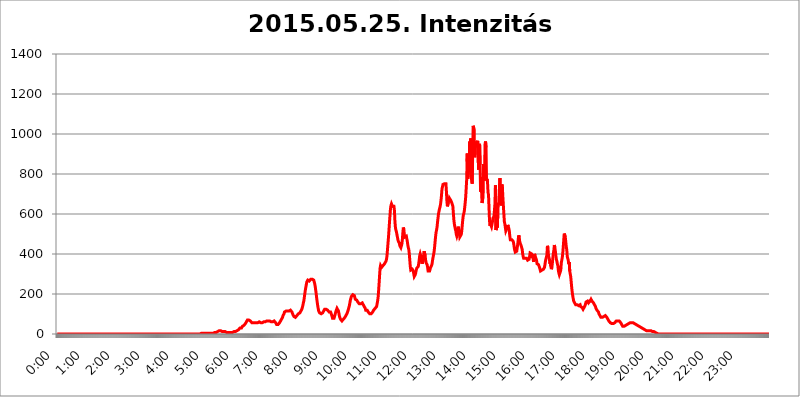
| Category | 2015.05.25. Intenzitás [W/m^2] |
|---|---|
| 0.0 | 0 |
| 0.0006944444444444445 | 0 |
| 0.001388888888888889 | 0 |
| 0.0020833333333333333 | 0 |
| 0.002777777777777778 | 0 |
| 0.003472222222222222 | 0 |
| 0.004166666666666667 | 0 |
| 0.004861111111111111 | 0 |
| 0.005555555555555556 | 0 |
| 0.0062499999999999995 | 0 |
| 0.006944444444444444 | 0 |
| 0.007638888888888889 | 0 |
| 0.008333333333333333 | 0 |
| 0.009027777777777779 | 0 |
| 0.009722222222222222 | 0 |
| 0.010416666666666666 | 0 |
| 0.011111111111111112 | 0 |
| 0.011805555555555555 | 0 |
| 0.012499999999999999 | 0 |
| 0.013194444444444444 | 0 |
| 0.013888888888888888 | 0 |
| 0.014583333333333332 | 0 |
| 0.015277777777777777 | 0 |
| 0.015972222222222224 | 0 |
| 0.016666666666666666 | 0 |
| 0.017361111111111112 | 0 |
| 0.018055555555555557 | 0 |
| 0.01875 | 0 |
| 0.019444444444444445 | 0 |
| 0.02013888888888889 | 0 |
| 0.020833333333333332 | 0 |
| 0.02152777777777778 | 0 |
| 0.022222222222222223 | 0 |
| 0.02291666666666667 | 0 |
| 0.02361111111111111 | 0 |
| 0.024305555555555556 | 0 |
| 0.024999999999999998 | 0 |
| 0.025694444444444447 | 0 |
| 0.02638888888888889 | 0 |
| 0.027083333333333334 | 0 |
| 0.027777777777777776 | 0 |
| 0.02847222222222222 | 0 |
| 0.029166666666666664 | 0 |
| 0.029861111111111113 | 0 |
| 0.030555555555555555 | 0 |
| 0.03125 | 0 |
| 0.03194444444444445 | 0 |
| 0.03263888888888889 | 0 |
| 0.03333333333333333 | 0 |
| 0.034027777777777775 | 0 |
| 0.034722222222222224 | 0 |
| 0.035416666666666666 | 0 |
| 0.036111111111111115 | 0 |
| 0.03680555555555556 | 0 |
| 0.0375 | 0 |
| 0.03819444444444444 | 0 |
| 0.03888888888888889 | 0 |
| 0.03958333333333333 | 0 |
| 0.04027777777777778 | 0 |
| 0.04097222222222222 | 0 |
| 0.041666666666666664 | 0 |
| 0.042361111111111106 | 0 |
| 0.04305555555555556 | 0 |
| 0.043750000000000004 | 0 |
| 0.044444444444444446 | 0 |
| 0.04513888888888889 | 0 |
| 0.04583333333333334 | 0 |
| 0.04652777777777778 | 0 |
| 0.04722222222222222 | 0 |
| 0.04791666666666666 | 0 |
| 0.04861111111111111 | 0 |
| 0.049305555555555554 | 0 |
| 0.049999999999999996 | 0 |
| 0.05069444444444445 | 0 |
| 0.051388888888888894 | 0 |
| 0.052083333333333336 | 0 |
| 0.05277777777777778 | 0 |
| 0.05347222222222222 | 0 |
| 0.05416666666666667 | 0 |
| 0.05486111111111111 | 0 |
| 0.05555555555555555 | 0 |
| 0.05625 | 0 |
| 0.05694444444444444 | 0 |
| 0.057638888888888885 | 0 |
| 0.05833333333333333 | 0 |
| 0.05902777777777778 | 0 |
| 0.059722222222222225 | 0 |
| 0.06041666666666667 | 0 |
| 0.061111111111111116 | 0 |
| 0.06180555555555556 | 0 |
| 0.0625 | 0 |
| 0.06319444444444444 | 0 |
| 0.06388888888888888 | 0 |
| 0.06458333333333334 | 0 |
| 0.06527777777777778 | 0 |
| 0.06597222222222222 | 0 |
| 0.06666666666666667 | 0 |
| 0.06736111111111111 | 0 |
| 0.06805555555555555 | 0 |
| 0.06874999999999999 | 0 |
| 0.06944444444444443 | 0 |
| 0.07013888888888889 | 0 |
| 0.07083333333333333 | 0 |
| 0.07152777777777779 | 0 |
| 0.07222222222222223 | 0 |
| 0.07291666666666667 | 0 |
| 0.07361111111111111 | 0 |
| 0.07430555555555556 | 0 |
| 0.075 | 0 |
| 0.07569444444444444 | 0 |
| 0.0763888888888889 | 0 |
| 0.07708333333333334 | 0 |
| 0.07777777777777778 | 0 |
| 0.07847222222222222 | 0 |
| 0.07916666666666666 | 0 |
| 0.0798611111111111 | 0 |
| 0.08055555555555556 | 0 |
| 0.08125 | 0 |
| 0.08194444444444444 | 0 |
| 0.08263888888888889 | 0 |
| 0.08333333333333333 | 0 |
| 0.08402777777777777 | 0 |
| 0.08472222222222221 | 0 |
| 0.08541666666666665 | 0 |
| 0.08611111111111112 | 0 |
| 0.08680555555555557 | 0 |
| 0.08750000000000001 | 0 |
| 0.08819444444444445 | 0 |
| 0.08888888888888889 | 0 |
| 0.08958333333333333 | 0 |
| 0.09027777777777778 | 0 |
| 0.09097222222222222 | 0 |
| 0.09166666666666667 | 0 |
| 0.09236111111111112 | 0 |
| 0.09305555555555556 | 0 |
| 0.09375 | 0 |
| 0.09444444444444444 | 0 |
| 0.09513888888888888 | 0 |
| 0.09583333333333333 | 0 |
| 0.09652777777777777 | 0 |
| 0.09722222222222222 | 0 |
| 0.09791666666666667 | 0 |
| 0.09861111111111111 | 0 |
| 0.09930555555555555 | 0 |
| 0.09999999999999999 | 0 |
| 0.10069444444444443 | 0 |
| 0.1013888888888889 | 0 |
| 0.10208333333333335 | 0 |
| 0.10277777777777779 | 0 |
| 0.10347222222222223 | 0 |
| 0.10416666666666667 | 0 |
| 0.10486111111111111 | 0 |
| 0.10555555555555556 | 0 |
| 0.10625 | 0 |
| 0.10694444444444444 | 0 |
| 0.1076388888888889 | 0 |
| 0.10833333333333334 | 0 |
| 0.10902777777777778 | 0 |
| 0.10972222222222222 | 0 |
| 0.1111111111111111 | 0 |
| 0.11180555555555556 | 0 |
| 0.11180555555555556 | 0 |
| 0.1125 | 0 |
| 0.11319444444444444 | 0 |
| 0.11388888888888889 | 0 |
| 0.11458333333333333 | 0 |
| 0.11527777777777777 | 0 |
| 0.11597222222222221 | 0 |
| 0.11666666666666665 | 0 |
| 0.1173611111111111 | 0 |
| 0.11805555555555557 | 0 |
| 0.11944444444444445 | 0 |
| 0.12013888888888889 | 0 |
| 0.12083333333333333 | 0 |
| 0.12152777777777778 | 0 |
| 0.12222222222222223 | 0 |
| 0.12291666666666667 | 0 |
| 0.12291666666666667 | 0 |
| 0.12361111111111112 | 0 |
| 0.12430555555555556 | 0 |
| 0.125 | 0 |
| 0.12569444444444444 | 0 |
| 0.12638888888888888 | 0 |
| 0.12708333333333333 | 0 |
| 0.16875 | 0 |
| 0.12847222222222224 | 0 |
| 0.12916666666666668 | 0 |
| 0.12986111111111112 | 0 |
| 0.13055555555555556 | 0 |
| 0.13125 | 0 |
| 0.13194444444444445 | 0 |
| 0.1326388888888889 | 0 |
| 0.13333333333333333 | 0 |
| 0.13402777777777777 | 0 |
| 0.13402777777777777 | 0 |
| 0.13472222222222222 | 0 |
| 0.13541666666666666 | 0 |
| 0.1361111111111111 | 0 |
| 0.13749999999999998 | 0 |
| 0.13819444444444443 | 0 |
| 0.1388888888888889 | 0 |
| 0.13958333333333334 | 0 |
| 0.14027777777777778 | 0 |
| 0.14097222222222222 | 0 |
| 0.14166666666666666 | 0 |
| 0.1423611111111111 | 0 |
| 0.14305555555555557 | 0 |
| 0.14375000000000002 | 0 |
| 0.14444444444444446 | 0 |
| 0.1451388888888889 | 0 |
| 0.1451388888888889 | 0 |
| 0.14652777777777778 | 0 |
| 0.14722222222222223 | 0 |
| 0.14791666666666667 | 0 |
| 0.1486111111111111 | 0 |
| 0.14930555555555555 | 0 |
| 0.15 | 0 |
| 0.15069444444444444 | 0 |
| 0.15138888888888888 | 0 |
| 0.15208333333333332 | 0 |
| 0.15277777777777776 | 0 |
| 0.15347222222222223 | 0 |
| 0.15416666666666667 | 0 |
| 0.15486111111111112 | 0 |
| 0.15555555555555556 | 0 |
| 0.15625 | 0 |
| 0.15694444444444444 | 0 |
| 0.15763888888888888 | 0 |
| 0.15833333333333333 | 0 |
| 0.15902777777777777 | 0 |
| 0.15972222222222224 | 0 |
| 0.16041666666666668 | 0 |
| 0.16111111111111112 | 0 |
| 0.16180555555555556 | 0 |
| 0.1625 | 0 |
| 0.16319444444444445 | 0 |
| 0.1638888888888889 | 0 |
| 0.16458333333333333 | 0 |
| 0.16527777777777777 | 0 |
| 0.16597222222222222 | 0 |
| 0.16666666666666666 | 0 |
| 0.1673611111111111 | 0 |
| 0.16805555555555554 | 0 |
| 0.16874999999999998 | 0 |
| 0.16944444444444443 | 0 |
| 0.17013888888888887 | 0 |
| 0.1708333333333333 | 0 |
| 0.17152777777777775 | 0 |
| 0.17222222222222225 | 0 |
| 0.1729166666666667 | 0 |
| 0.17361111111111113 | 0 |
| 0.17430555555555557 | 0 |
| 0.17500000000000002 | 0 |
| 0.17569444444444446 | 0 |
| 0.1763888888888889 | 0 |
| 0.17708333333333334 | 0 |
| 0.17777777777777778 | 0 |
| 0.17847222222222223 | 0 |
| 0.17916666666666667 | 0 |
| 0.1798611111111111 | 0 |
| 0.18055555555555555 | 0 |
| 0.18125 | 0 |
| 0.18194444444444444 | 0 |
| 0.1826388888888889 | 0 |
| 0.18333333333333335 | 0 |
| 0.1840277777777778 | 0 |
| 0.18472222222222223 | 0 |
| 0.18541666666666667 | 0 |
| 0.18611111111111112 | 0 |
| 0.18680555555555556 | 0 |
| 0.1875 | 0 |
| 0.18819444444444444 | 0 |
| 0.18888888888888888 | 0 |
| 0.18958333333333333 | 0 |
| 0.19027777777777777 | 0 |
| 0.1909722222222222 | 0 |
| 0.19166666666666665 | 0 |
| 0.19236111111111112 | 0 |
| 0.19305555555555554 | 0 |
| 0.19375 | 0 |
| 0.19444444444444445 | 0 |
| 0.1951388888888889 | 0 |
| 0.19583333333333333 | 0 |
| 0.19652777777777777 | 0 |
| 0.19722222222222222 | 0 |
| 0.19791666666666666 | 0 |
| 0.1986111111111111 | 0 |
| 0.19930555555555554 | 0 |
| 0.19999999999999998 | 0 |
| 0.20069444444444443 | 0 |
| 0.20138888888888887 | 0 |
| 0.2020833333333333 | 3.525 |
| 0.2027777777777778 | 0 |
| 0.2034722222222222 | 3.525 |
| 0.2041666666666667 | 3.525 |
| 0.20486111111111113 | 3.525 |
| 0.20555555555555557 | 3.525 |
| 0.20625000000000002 | 3.525 |
| 0.20694444444444446 | 3.525 |
| 0.2076388888888889 | 3.525 |
| 0.20833333333333334 | 3.525 |
| 0.20902777777777778 | 3.525 |
| 0.20972222222222223 | 3.525 |
| 0.21041666666666667 | 3.525 |
| 0.2111111111111111 | 3.525 |
| 0.21180555555555555 | 3.525 |
| 0.2125 | 3.525 |
| 0.21319444444444444 | 3.525 |
| 0.2138888888888889 | 3.525 |
| 0.21458333333333335 | 3.525 |
| 0.2152777777777778 | 3.525 |
| 0.21597222222222223 | 3.525 |
| 0.21666666666666667 | 3.525 |
| 0.21736111111111112 | 3.525 |
| 0.21805555555555556 | 3.525 |
| 0.21875 | 3.525 |
| 0.21944444444444444 | 3.525 |
| 0.22013888888888888 | 7.887 |
| 0.22083333333333333 | 7.887 |
| 0.22152777777777777 | 7.887 |
| 0.2222222222222222 | 7.887 |
| 0.22291666666666665 | 7.887 |
| 0.2236111111111111 | 12.257 |
| 0.22430555555555556 | 12.257 |
| 0.225 | 12.257 |
| 0.22569444444444445 | 12.257 |
| 0.2263888888888889 | 16.636 |
| 0.22708333333333333 | 16.636 |
| 0.22777777777777777 | 16.636 |
| 0.22847222222222222 | 16.636 |
| 0.22916666666666666 | 16.636 |
| 0.2298611111111111 | 16.636 |
| 0.23055555555555554 | 12.257 |
| 0.23124999999999998 | 12.257 |
| 0.23194444444444443 | 12.257 |
| 0.23263888888888887 | 12.257 |
| 0.2333333333333333 | 12.257 |
| 0.2340277777777778 | 12.257 |
| 0.2347222222222222 | 12.257 |
| 0.2354166666666667 | 12.257 |
| 0.23611111111111113 | 12.257 |
| 0.23680555555555557 | 7.887 |
| 0.23750000000000002 | 7.887 |
| 0.23819444444444446 | 7.887 |
| 0.2388888888888889 | 7.887 |
| 0.23958333333333334 | 7.887 |
| 0.24027777777777778 | 7.887 |
| 0.24097222222222223 | 7.887 |
| 0.24166666666666667 | 7.887 |
| 0.2423611111111111 | 7.887 |
| 0.24305555555555555 | 7.887 |
| 0.24375 | 7.887 |
| 0.24444444444444446 | 12.257 |
| 0.24513888888888888 | 12.257 |
| 0.24583333333333335 | 7.887 |
| 0.2465277777777778 | 12.257 |
| 0.24722222222222223 | 12.257 |
| 0.24791666666666667 | 12.257 |
| 0.24861111111111112 | 12.257 |
| 0.24930555555555556 | 12.257 |
| 0.25 | 12.257 |
| 0.25069444444444444 | 16.636 |
| 0.2513888888888889 | 16.636 |
| 0.2520833333333333 | 16.636 |
| 0.25277777777777777 | 21.024 |
| 0.2534722222222222 | 21.024 |
| 0.25416666666666665 | 21.024 |
| 0.2548611111111111 | 25.419 |
| 0.2555555555555556 | 25.419 |
| 0.25625000000000003 | 29.823 |
| 0.2569444444444445 | 29.823 |
| 0.2576388888888889 | 29.823 |
| 0.25833333333333336 | 29.823 |
| 0.2590277777777778 | 34.234 |
| 0.25972222222222224 | 38.653 |
| 0.2604166666666667 | 38.653 |
| 0.2611111111111111 | 38.653 |
| 0.26180555555555557 | 43.079 |
| 0.2625 | 47.511 |
| 0.26319444444444445 | 47.511 |
| 0.2638888888888889 | 51.951 |
| 0.26458333333333334 | 56.398 |
| 0.2652777777777778 | 60.85 |
| 0.2659722222222222 | 65.31 |
| 0.26666666666666666 | 69.775 |
| 0.2673611111111111 | 74.246 |
| 0.26805555555555555 | 69.775 |
| 0.26875 | 69.775 |
| 0.26944444444444443 | 69.775 |
| 0.2701388888888889 | 65.31 |
| 0.2708333333333333 | 65.31 |
| 0.27152777777777776 | 60.85 |
| 0.2722222222222222 | 60.85 |
| 0.27291666666666664 | 56.398 |
| 0.2736111111111111 | 56.398 |
| 0.2743055555555555 | 56.398 |
| 0.27499999999999997 | 56.398 |
| 0.27569444444444446 | 56.398 |
| 0.27638888888888885 | 56.398 |
| 0.27708333333333335 | 56.398 |
| 0.2777777777777778 | 56.398 |
| 0.27847222222222223 | 56.398 |
| 0.2791666666666667 | 56.398 |
| 0.2798611111111111 | 56.398 |
| 0.28055555555555556 | 56.398 |
| 0.28125 | 56.398 |
| 0.28194444444444444 | 56.398 |
| 0.2826388888888889 | 60.85 |
| 0.2833333333333333 | 60.85 |
| 0.28402777777777777 | 60.85 |
| 0.2847222222222222 | 60.85 |
| 0.28541666666666665 | 56.398 |
| 0.28611111111111115 | 56.398 |
| 0.28680555555555554 | 56.398 |
| 0.28750000000000003 | 56.398 |
| 0.2881944444444445 | 56.398 |
| 0.2888888888888889 | 56.398 |
| 0.28958333333333336 | 60.85 |
| 0.2902777777777778 | 60.85 |
| 0.29097222222222224 | 60.85 |
| 0.2916666666666667 | 60.85 |
| 0.2923611111111111 | 60.85 |
| 0.29305555555555557 | 65.31 |
| 0.29375 | 65.31 |
| 0.29444444444444445 | 65.31 |
| 0.2951388888888889 | 65.31 |
| 0.29583333333333334 | 65.31 |
| 0.2965277777777778 | 65.31 |
| 0.2972222222222222 | 65.31 |
| 0.29791666666666666 | 65.31 |
| 0.2986111111111111 | 65.31 |
| 0.29930555555555555 | 65.31 |
| 0.3 | 60.85 |
| 0.30069444444444443 | 60.85 |
| 0.3013888888888889 | 60.85 |
| 0.3020833333333333 | 60.85 |
| 0.30277777777777776 | 60.85 |
| 0.3034722222222222 | 65.31 |
| 0.30416666666666664 | 65.31 |
| 0.3048611111111111 | 60.85 |
| 0.3055555555555555 | 60.85 |
| 0.30624999999999997 | 56.398 |
| 0.3069444444444444 | 51.951 |
| 0.3076388888888889 | 47.511 |
| 0.30833333333333335 | 47.511 |
| 0.3090277777777778 | 47.511 |
| 0.30972222222222223 | 47.511 |
| 0.3104166666666667 | 47.511 |
| 0.3111111111111111 | 51.951 |
| 0.31180555555555556 | 56.398 |
| 0.3125 | 60.85 |
| 0.31319444444444444 | 65.31 |
| 0.3138888888888889 | 69.775 |
| 0.3145833333333333 | 74.246 |
| 0.31527777777777777 | 78.722 |
| 0.3159722222222222 | 83.205 |
| 0.31666666666666665 | 92.184 |
| 0.31736111111111115 | 96.682 |
| 0.31805555555555554 | 101.184 |
| 0.31875000000000003 | 110.201 |
| 0.3194444444444445 | 110.201 |
| 0.3201388888888889 | 110.201 |
| 0.32083333333333336 | 114.716 |
| 0.3215277777777778 | 114.716 |
| 0.32222222222222224 | 114.716 |
| 0.3229166666666667 | 114.716 |
| 0.3236111111111111 | 110.201 |
| 0.32430555555555557 | 110.201 |
| 0.325 | 114.716 |
| 0.32569444444444445 | 114.716 |
| 0.3263888888888889 | 119.235 |
| 0.32708333333333334 | 119.235 |
| 0.3277777777777778 | 119.235 |
| 0.3284722222222222 | 114.716 |
| 0.32916666666666666 | 110.201 |
| 0.3298611111111111 | 105.69 |
| 0.33055555555555555 | 96.682 |
| 0.33125 | 92.184 |
| 0.33194444444444443 | 87.692 |
| 0.3326388888888889 | 83.205 |
| 0.3333333333333333 | 83.205 |
| 0.3340277777777778 | 83.205 |
| 0.3347222222222222 | 83.205 |
| 0.3354166666666667 | 87.692 |
| 0.3361111111111111 | 92.184 |
| 0.3368055555555556 | 92.184 |
| 0.33749999999999997 | 96.682 |
| 0.33819444444444446 | 101.184 |
| 0.33888888888888885 | 101.184 |
| 0.33958333333333335 | 105.69 |
| 0.34027777777777773 | 105.69 |
| 0.34097222222222223 | 110.201 |
| 0.3416666666666666 | 114.716 |
| 0.3423611111111111 | 119.235 |
| 0.3430555555555555 | 123.758 |
| 0.34375 | 132.814 |
| 0.3444444444444445 | 141.884 |
| 0.3451388888888889 | 155.509 |
| 0.3458333333333334 | 164.605 |
| 0.34652777777777777 | 182.82 |
| 0.34722222222222227 | 201.058 |
| 0.34791666666666665 | 219.309 |
| 0.34861111111111115 | 233 |
| 0.34930555555555554 | 246.689 |
| 0.35000000000000003 | 260.373 |
| 0.3506944444444444 | 264.932 |
| 0.3513888888888889 | 269.49 |
| 0.3520833333333333 | 269.49 |
| 0.3527777777777778 | 264.932 |
| 0.3534722222222222 | 264.932 |
| 0.3541666666666667 | 264.932 |
| 0.3548611111111111 | 269.49 |
| 0.35555555555555557 | 274.047 |
| 0.35625 | 278.603 |
| 0.35694444444444445 | 278.603 |
| 0.3576388888888889 | 274.047 |
| 0.35833333333333334 | 274.047 |
| 0.3590277777777778 | 274.047 |
| 0.3597222222222222 | 269.49 |
| 0.36041666666666666 | 264.932 |
| 0.3611111111111111 | 251.251 |
| 0.36180555555555555 | 237.564 |
| 0.3625 | 219.309 |
| 0.36319444444444443 | 201.058 |
| 0.3638888888888889 | 178.264 |
| 0.3645833333333333 | 160.056 |
| 0.3652777777777778 | 141.884 |
| 0.3659722222222222 | 128.284 |
| 0.3666666666666667 | 114.716 |
| 0.3673611111111111 | 110.201 |
| 0.3680555555555556 | 105.69 |
| 0.36874999999999997 | 101.184 |
| 0.36944444444444446 | 101.184 |
| 0.37013888888888885 | 101.184 |
| 0.37083333333333335 | 101.184 |
| 0.37152777777777773 | 101.184 |
| 0.37222222222222223 | 105.69 |
| 0.3729166666666666 | 110.201 |
| 0.3736111111111111 | 114.716 |
| 0.3743055555555555 | 119.235 |
| 0.375 | 123.758 |
| 0.3756944444444445 | 128.284 |
| 0.3763888888888889 | 128.284 |
| 0.3770833333333334 | 123.758 |
| 0.37777777777777777 | 123.758 |
| 0.37847222222222227 | 119.235 |
| 0.37916666666666665 | 119.235 |
| 0.37986111111111115 | 119.235 |
| 0.38055555555555554 | 114.716 |
| 0.38125000000000003 | 110.201 |
| 0.3819444444444444 | 110.201 |
| 0.3826388888888889 | 110.201 |
| 0.3833333333333333 | 110.201 |
| 0.3840277777777778 | 105.69 |
| 0.3847222222222222 | 96.682 |
| 0.3854166666666667 | 87.692 |
| 0.3861111111111111 | 78.722 |
| 0.38680555555555557 | 74.246 |
| 0.3875 | 74.246 |
| 0.38819444444444445 | 78.722 |
| 0.3888888888888889 | 87.692 |
| 0.38958333333333334 | 96.682 |
| 0.3902777777777778 | 105.69 |
| 0.3909722222222222 | 114.716 |
| 0.39166666666666666 | 119.235 |
| 0.3923611111111111 | 128.284 |
| 0.39305555555555555 | 128.284 |
| 0.39375 | 128.284 |
| 0.39444444444444443 | 114.716 |
| 0.3951388888888889 | 101.184 |
| 0.3958333333333333 | 87.692 |
| 0.3965277777777778 | 83.205 |
| 0.3972222222222222 | 74.246 |
| 0.3979166666666667 | 74.246 |
| 0.3986111111111111 | 69.775 |
| 0.3993055555555556 | 65.31 |
| 0.39999999999999997 | 69.775 |
| 0.40069444444444446 | 69.775 |
| 0.40138888888888885 | 74.246 |
| 0.40208333333333335 | 74.246 |
| 0.40277777777777773 | 78.722 |
| 0.40347222222222223 | 83.205 |
| 0.4041666666666666 | 87.692 |
| 0.4048611111111111 | 92.184 |
| 0.4055555555555555 | 92.184 |
| 0.40625 | 101.184 |
| 0.4069444444444445 | 105.69 |
| 0.4076388888888889 | 114.716 |
| 0.4083333333333334 | 123.758 |
| 0.40902777777777777 | 132.814 |
| 0.40972222222222227 | 141.884 |
| 0.41041666666666665 | 155.509 |
| 0.41111111111111115 | 169.156 |
| 0.41180555555555554 | 178.264 |
| 0.41250000000000003 | 187.378 |
| 0.4131944444444444 | 187.378 |
| 0.4138888888888889 | 187.378 |
| 0.4145833333333333 | 196.497 |
| 0.4152777777777778 | 201.058 |
| 0.4159722222222222 | 196.497 |
| 0.4166666666666667 | 191.937 |
| 0.4173611111111111 | 182.82 |
| 0.41805555555555557 | 173.709 |
| 0.41875 | 173.709 |
| 0.41944444444444445 | 169.156 |
| 0.4201388888888889 | 169.156 |
| 0.42083333333333334 | 164.605 |
| 0.4215277777777778 | 160.056 |
| 0.4222222222222222 | 160.056 |
| 0.42291666666666666 | 155.509 |
| 0.4236111111111111 | 150.964 |
| 0.42430555555555555 | 150.964 |
| 0.425 | 150.964 |
| 0.42569444444444443 | 150.964 |
| 0.4263888888888889 | 155.509 |
| 0.4270833333333333 | 155.509 |
| 0.4277777777777778 | 155.509 |
| 0.4284722222222222 | 150.964 |
| 0.4291666666666667 | 146.423 |
| 0.4298611111111111 | 146.423 |
| 0.4305555555555556 | 137.347 |
| 0.43124999999999997 | 132.814 |
| 0.43194444444444446 | 128.284 |
| 0.43263888888888885 | 119.235 |
| 0.43333333333333335 | 119.235 |
| 0.43402777777777773 | 119.235 |
| 0.43472222222222223 | 119.235 |
| 0.4354166666666666 | 114.716 |
| 0.4361111111111111 | 110.201 |
| 0.4368055555555555 | 105.69 |
| 0.4375 | 105.69 |
| 0.4381944444444445 | 101.184 |
| 0.4388888888888889 | 101.184 |
| 0.4395833333333334 | 101.184 |
| 0.44027777777777777 | 101.184 |
| 0.44097222222222227 | 101.184 |
| 0.44166666666666665 | 105.69 |
| 0.44236111111111115 | 110.201 |
| 0.44305555555555554 | 114.716 |
| 0.44375000000000003 | 119.235 |
| 0.4444444444444444 | 123.758 |
| 0.4451388888888889 | 123.758 |
| 0.4458333333333333 | 128.284 |
| 0.4465277777777778 | 132.814 |
| 0.4472222222222222 | 132.814 |
| 0.4479166666666667 | 137.347 |
| 0.4486111111111111 | 150.964 |
| 0.44930555555555557 | 164.605 |
| 0.45 | 182.82 |
| 0.45069444444444445 | 214.746 |
| 0.4513888888888889 | 251.251 |
| 0.45208333333333334 | 292.259 |
| 0.4527777777777778 | 328.584 |
| 0.4534722222222222 | 342.162 |
| 0.45416666666666666 | 342.162 |
| 0.4548611111111111 | 333.113 |
| 0.45555555555555555 | 333.113 |
| 0.45625 | 337.639 |
| 0.45694444444444443 | 342.162 |
| 0.4576388888888889 | 346.682 |
| 0.4583333333333333 | 346.682 |
| 0.4590277777777778 | 351.198 |
| 0.4597222222222222 | 351.198 |
| 0.4604166666666667 | 355.712 |
| 0.4611111111111111 | 364.728 |
| 0.4618055555555556 | 373.729 |
| 0.46249999999999997 | 391.685 |
| 0.46319444444444446 | 422.943 |
| 0.46388888888888885 | 453.968 |
| 0.46458333333333335 | 484.735 |
| 0.46527777777777773 | 519.555 |
| 0.46597222222222223 | 558.261 |
| 0.4666666666666666 | 592.233 |
| 0.4673611111111111 | 625.784 |
| 0.4680555555555555 | 642.4 |
| 0.46875 | 650.667 |
| 0.4694444444444445 | 646.537 |
| 0.4701388888888889 | 638.256 |
| 0.4708333333333334 | 634.105 |
| 0.47152777777777777 | 638.256 |
| 0.47222222222222227 | 638.256 |
| 0.47291666666666665 | 617.436 |
| 0.47361111111111115 | 562.53 |
| 0.47430555555555554 | 532.513 |
| 0.47500000000000003 | 519.555 |
| 0.4756944444444444 | 510.885 |
| 0.4763888888888889 | 497.836 |
| 0.4770833333333333 | 484.735 |
| 0.4777777777777778 | 471.582 |
| 0.4784722222222222 | 462.786 |
| 0.4791666666666667 | 462.786 |
| 0.4798611111111111 | 453.968 |
| 0.48055555555555557 | 440.702 |
| 0.48125 | 436.27 |
| 0.48194444444444445 | 431.833 |
| 0.4826388888888889 | 436.27 |
| 0.48333333333333334 | 449.551 |
| 0.4840277777777778 | 471.582 |
| 0.4847222222222222 | 506.542 |
| 0.48541666666666666 | 532.513 |
| 0.4861111111111111 | 523.88 |
| 0.48680555555555555 | 497.836 |
| 0.4875 | 484.735 |
| 0.48819444444444443 | 484.735 |
| 0.4888888888888889 | 489.108 |
| 0.4895833333333333 | 489.108 |
| 0.4902777777777778 | 475.972 |
| 0.4909722222222222 | 462.786 |
| 0.4916666666666667 | 445.129 |
| 0.4923611111111111 | 431.833 |
| 0.4930555555555556 | 422.943 |
| 0.49374999999999997 | 400.638 |
| 0.49444444444444446 | 369.23 |
| 0.49513888888888885 | 337.639 |
| 0.49583333333333335 | 319.517 |
| 0.49652777777777773 | 314.98 |
| 0.49722222222222223 | 319.517 |
| 0.4979166666666666 | 324.052 |
| 0.4986111111111111 | 319.517 |
| 0.4993055555555555 | 314.98 |
| 0.5 | 301.354 |
| 0.5006944444444444 | 287.709 |
| 0.5013888888888889 | 287.709 |
| 0.5020833333333333 | 296.808 |
| 0.5027777777777778 | 305.898 |
| 0.5034722222222222 | 319.517 |
| 0.5041666666666667 | 328.584 |
| 0.5048611111111111 | 328.584 |
| 0.5055555555555555 | 333.113 |
| 0.50625 | 337.639 |
| 0.5069444444444444 | 351.198 |
| 0.5076388888888889 | 369.23 |
| 0.5083333333333333 | 391.685 |
| 0.5090277777777777 | 400.638 |
| 0.5097222222222222 | 391.685 |
| 0.5104166666666666 | 382.715 |
| 0.5111111111111112 | 364.728 |
| 0.5118055555555555 | 351.198 |
| 0.5125000000000001 | 351.198 |
| 0.5131944444444444 | 369.23 |
| 0.513888888888889 | 396.164 |
| 0.5145833333333333 | 414.035 |
| 0.5152777777777778 | 409.574 |
| 0.5159722222222222 | 391.685 |
| 0.5166666666666667 | 369.23 |
| 0.517361111111111 | 355.712 |
| 0.5180555555555556 | 351.198 |
| 0.5187499999999999 | 346.682 |
| 0.5194444444444445 | 333.113 |
| 0.5201388888888888 | 314.98 |
| 0.5208333333333334 | 310.44 |
| 0.5215277777777778 | 310.44 |
| 0.5222222222222223 | 314.98 |
| 0.5229166666666667 | 324.052 |
| 0.5236111111111111 | 333.113 |
| 0.5243055555555556 | 333.113 |
| 0.525 | 342.162 |
| 0.5256944444444445 | 351.198 |
| 0.5263888888888889 | 369.23 |
| 0.5270833333333333 | 382.715 |
| 0.5277777777777778 | 396.164 |
| 0.5284722222222222 | 409.574 |
| 0.5291666666666667 | 431.833 |
| 0.5298611111111111 | 458.38 |
| 0.5305555555555556 | 484.735 |
| 0.53125 | 506.542 |
| 0.5319444444444444 | 519.555 |
| 0.5326388888888889 | 532.513 |
| 0.5333333333333333 | 558.261 |
| 0.5340277777777778 | 579.542 |
| 0.5347222222222222 | 600.661 |
| 0.5354166666666667 | 613.252 |
| 0.5361111111111111 | 625.784 |
| 0.5368055555555555 | 634.105 |
| 0.5375 | 646.537 |
| 0.5381944444444444 | 667.123 |
| 0.5388888888888889 | 691.608 |
| 0.5395833333333333 | 723.889 |
| 0.5402777777777777 | 727.896 |
| 0.5409722222222222 | 747.834 |
| 0.5416666666666666 | 743.859 |
| 0.5423611111111112 | 743.859 |
| 0.5430555555555555 | 751.803 |
| 0.5437500000000001 | 751.803 |
| 0.5444444444444444 | 755.766 |
| 0.545138888888889 | 751.803 |
| 0.5458333333333333 | 711.832 |
| 0.5465277777777778 | 663.019 |
| 0.5472222222222222 | 638.256 |
| 0.5479166666666667 | 642.4 |
| 0.548611111111111 | 658.909 |
| 0.5493055555555556 | 667.123 |
| 0.5499999999999999 | 679.395 |
| 0.5506944444444445 | 679.395 |
| 0.5513888888888888 | 675.311 |
| 0.5520833333333334 | 667.123 |
| 0.5527777777777778 | 663.019 |
| 0.5534722222222223 | 654.791 |
| 0.5541666666666667 | 658.909 |
| 0.5548611111111111 | 638.256 |
| 0.5555555555555556 | 604.864 |
| 0.55625 | 571.049 |
| 0.5569444444444445 | 549.704 |
| 0.5576388888888889 | 536.82 |
| 0.5583333333333333 | 523.88 |
| 0.5590277777777778 | 515.223 |
| 0.5597222222222222 | 497.836 |
| 0.5604166666666667 | 489.108 |
| 0.5611111111111111 | 497.836 |
| 0.5618055555555556 | 519.555 |
| 0.5625 | 536.82 |
| 0.5631944444444444 | 532.513 |
| 0.5638888888888889 | 506.542 |
| 0.5645833333333333 | 484.735 |
| 0.5652777777777778 | 480.356 |
| 0.5659722222222222 | 489.108 |
| 0.5666666666666667 | 497.836 |
| 0.5673611111111111 | 515.223 |
| 0.5680555555555555 | 545.416 |
| 0.56875 | 571.049 |
| 0.5694444444444444 | 592.233 |
| 0.5701388888888889 | 600.661 |
| 0.5708333333333333 | 613.252 |
| 0.5715277777777777 | 634.105 |
| 0.5722222222222222 | 658.909 |
| 0.5729166666666666 | 687.544 |
| 0.5736111111111112 | 731.896 |
| 0.5743055555555555 | 775.492 |
| 0.5750000000000001 | 902.447 |
| 0.5756944444444444 | 775.492 |
| 0.576388888888889 | 775.492 |
| 0.5770833333333333 | 775.492 |
| 0.5777777777777778 | 856.855 |
| 0.5784722222222222 | 962.555 |
| 0.5791666666666667 | 849.199 |
| 0.579861111111111 | 977.508 |
| 0.5805555555555556 | 795.074 |
| 0.5812499999999999 | 767.62 |
| 0.5819444444444445 | 751.803 |
| 0.5826388888888888 | 894.885 |
| 0.5833333333333334 | 1041.019 |
| 0.5840277777777778 | 1033.537 |
| 0.5847222222222223 | 1022.323 |
| 0.5854166666666667 | 883.516 |
| 0.5861111111111111 | 913.766 |
| 0.5868055555555556 | 962.555 |
| 0.5875 | 943.832 |
| 0.5881944444444445 | 951.327 |
| 0.5888888888888889 | 958.814 |
| 0.5895833333333333 | 966.295 |
| 0.5902777777777778 | 970.034 |
| 0.5909722222222222 | 822.26 |
| 0.5916666666666667 | 936.33 |
| 0.5923611111111111 | 951.327 |
| 0.5930555555555556 | 845.365 |
| 0.59375 | 711.832 |
| 0.5944444444444444 | 783.342 |
| 0.5951388888888889 | 711.832 |
| 0.5958333333333333 | 654.791 |
| 0.5965277777777778 | 671.22 |
| 0.5972222222222222 | 683.473 |
| 0.5979166666666667 | 849.199 |
| 0.5986111111111111 | 767.62 |
| 0.5993055555555555 | 795.074 |
| 0.6 | 947.58 |
| 0.6006944444444444 | 962.555 |
| 0.6013888888888889 | 932.576 |
| 0.6020833333333333 | 767.62 |
| 0.6027777777777777 | 775.492 |
| 0.6034722222222222 | 759.723 |
| 0.6041666666666666 | 707.8 |
| 0.6048611111111112 | 695.666 |
| 0.6055555555555555 | 634.105 |
| 0.6062500000000001 | 566.793 |
| 0.6069444444444444 | 541.121 |
| 0.607638888888889 | 549.704 |
| 0.6083333333333333 | 545.416 |
| 0.6090277777777778 | 536.82 |
| 0.6097222222222222 | 541.121 |
| 0.6104166666666667 | 562.53 |
| 0.611111111111111 | 579.542 |
| 0.6118055555555556 | 579.542 |
| 0.6124999999999999 | 588.009 |
| 0.6131944444444445 | 592.233 |
| 0.6138888888888888 | 650.667 |
| 0.6145833333333334 | 743.859 |
| 0.6152777777777778 | 519.555 |
| 0.6159722222222223 | 528.2 |
| 0.6166666666666667 | 553.986 |
| 0.6173611111111111 | 532.513 |
| 0.6180555555555556 | 642.4 |
| 0.61875 | 646.537 |
| 0.6194444444444445 | 658.909 |
| 0.6201388888888889 | 727.896 |
| 0.6208333333333333 | 779.42 |
| 0.6215277777777778 | 699.717 |
| 0.6222222222222222 | 642.4 |
| 0.6229166666666667 | 715.858 |
| 0.6236111111111111 | 747.834 |
| 0.6243055555555556 | 735.89 |
| 0.625 | 683.473 |
| 0.6256944444444444 | 679.395 |
| 0.6263888888888889 | 600.661 |
| 0.6270833333333333 | 562.53 |
| 0.6277777777777778 | 549.704 |
| 0.6284722222222222 | 532.513 |
| 0.6291666666666667 | 515.223 |
| 0.6298611111111111 | 510.885 |
| 0.6305555555555555 | 519.555 |
| 0.63125 | 532.513 |
| 0.6319444444444444 | 545.416 |
| 0.6326388888888889 | 536.82 |
| 0.6333333333333333 | 528.2 |
| 0.6340277777777777 | 515.223 |
| 0.6347222222222222 | 489.108 |
| 0.6354166666666666 | 471.582 |
| 0.6361111111111112 | 471.582 |
| 0.6368055555555555 | 475.972 |
| 0.6375000000000001 | 471.582 |
| 0.6381944444444444 | 471.582 |
| 0.638888888888889 | 471.582 |
| 0.6395833333333333 | 462.786 |
| 0.6402777777777778 | 449.551 |
| 0.6409722222222222 | 431.833 |
| 0.6416666666666667 | 418.492 |
| 0.642361111111111 | 409.574 |
| 0.6430555555555556 | 405.108 |
| 0.6437499999999999 | 405.108 |
| 0.6444444444444445 | 414.035 |
| 0.6451388888888888 | 431.833 |
| 0.6458333333333334 | 449.551 |
| 0.6465277777777778 | 471.582 |
| 0.6472222222222223 | 493.475 |
| 0.6479166666666667 | 484.735 |
| 0.6486111111111111 | 462.786 |
| 0.6493055555555556 | 453.968 |
| 0.65 | 449.551 |
| 0.6506944444444445 | 440.702 |
| 0.6513888888888889 | 436.27 |
| 0.6520833333333333 | 422.943 |
| 0.6527777777777778 | 400.638 |
| 0.6534722222222222 | 387.202 |
| 0.6541666666666667 | 378.224 |
| 0.6548611111111111 | 373.729 |
| 0.6555555555555556 | 378.224 |
| 0.65625 | 378.224 |
| 0.6569444444444444 | 378.224 |
| 0.6576388888888889 | 378.224 |
| 0.6583333333333333 | 378.224 |
| 0.6590277777777778 | 373.729 |
| 0.6597222222222222 | 369.23 |
| 0.6604166666666667 | 364.728 |
| 0.6611111111111111 | 364.728 |
| 0.6618055555555555 | 373.729 |
| 0.6625 | 387.202 |
| 0.6631944444444444 | 405.108 |
| 0.6638888888888889 | 405.108 |
| 0.6645833333333333 | 405.108 |
| 0.6652777777777777 | 400.638 |
| 0.6659722222222222 | 387.202 |
| 0.6666666666666666 | 382.715 |
| 0.6673611111111111 | 378.224 |
| 0.6680555555555556 | 360.221 |
| 0.6687500000000001 | 382.715 |
| 0.6694444444444444 | 400.638 |
| 0.6701388888888888 | 391.685 |
| 0.6708333333333334 | 396.164 |
| 0.6715277777777778 | 391.685 |
| 0.6722222222222222 | 369.23 |
| 0.6729166666666666 | 351.198 |
| 0.6736111111111112 | 351.198 |
| 0.6743055555555556 | 351.198 |
| 0.6749999999999999 | 346.682 |
| 0.6756944444444444 | 342.162 |
| 0.6763888888888889 | 333.113 |
| 0.6770833333333334 | 324.052 |
| 0.6777777777777777 | 314.98 |
| 0.6784722222222223 | 310.44 |
| 0.6791666666666667 | 314.98 |
| 0.6798611111111111 | 319.517 |
| 0.6805555555555555 | 324.052 |
| 0.68125 | 324.052 |
| 0.6819444444444445 | 324.052 |
| 0.6826388888888889 | 324.052 |
| 0.6833333333333332 | 333.113 |
| 0.6840277777777778 | 346.682 |
| 0.6847222222222222 | 364.728 |
| 0.6854166666666667 | 360.221 |
| 0.686111111111111 | 369.23 |
| 0.6868055555555556 | 396.164 |
| 0.6875 | 440.702 |
| 0.6881944444444444 | 431.833 |
| 0.688888888888889 | 396.164 |
| 0.6895833333333333 | 382.715 |
| 0.6902777777777778 | 373.729 |
| 0.6909722222222222 | 351.198 |
| 0.6916666666666668 | 360.221 |
| 0.6923611111111111 | 337.639 |
| 0.6930555555555555 | 324.052 |
| 0.69375 | 333.113 |
| 0.6944444444444445 | 355.712 |
| 0.6951388888888889 | 382.715 |
| 0.6958333333333333 | 405.108 |
| 0.6965277777777777 | 418.492 |
| 0.6972222222222223 | 445.129 |
| 0.6979166666666666 | 431.833 |
| 0.6986111111111111 | 414.035 |
| 0.6993055555555556 | 391.685 |
| 0.7000000000000001 | 373.729 |
| 0.7006944444444444 | 364.728 |
| 0.7013888888888888 | 351.198 |
| 0.7020833333333334 | 342.162 |
| 0.7027777777777778 | 319.517 |
| 0.7034722222222222 | 305.898 |
| 0.7041666666666666 | 296.808 |
| 0.7048611111111112 | 292.259 |
| 0.7055555555555556 | 296.808 |
| 0.7062499999999999 | 319.517 |
| 0.7069444444444444 | 355.712 |
| 0.7076388888888889 | 369.23 |
| 0.7083333333333334 | 382.715 |
| 0.7090277777777777 | 405.108 |
| 0.7097222222222223 | 436.27 |
| 0.7104166666666667 | 471.582 |
| 0.7111111111111111 | 502.192 |
| 0.7118055555555555 | 506.542 |
| 0.7125 | 484.735 |
| 0.7131944444444445 | 462.786 |
| 0.7138888888888889 | 436.27 |
| 0.7145833333333332 | 422.943 |
| 0.7152777777777778 | 387.202 |
| 0.7159722222222222 | 391.685 |
| 0.7166666666666667 | 369.23 |
| 0.717361111111111 | 351.198 |
| 0.7180555555555556 | 360.221 |
| 0.71875 | 314.98 |
| 0.7194444444444444 | 310.44 |
| 0.720138888888889 | 287.709 |
| 0.7208333333333333 | 260.373 |
| 0.7215277777777778 | 233 |
| 0.7222222222222222 | 210.182 |
| 0.7229166666666668 | 191.937 |
| 0.7236111111111111 | 178.264 |
| 0.7243055555555555 | 164.605 |
| 0.725 | 160.056 |
| 0.7256944444444445 | 155.509 |
| 0.7263888888888889 | 150.964 |
| 0.7270833333333333 | 146.423 |
| 0.7277777777777777 | 146.423 |
| 0.7284722222222223 | 146.423 |
| 0.7291666666666666 | 146.423 |
| 0.7298611111111111 | 146.423 |
| 0.7305555555555556 | 141.884 |
| 0.7312500000000001 | 141.884 |
| 0.7319444444444444 | 141.884 |
| 0.7326388888888888 | 146.423 |
| 0.7333333333333334 | 146.423 |
| 0.7340277777777778 | 137.347 |
| 0.7347222222222222 | 137.347 |
| 0.7354166666666666 | 132.814 |
| 0.7361111111111112 | 132.814 |
| 0.7368055555555556 | 128.284 |
| 0.7374999999999999 | 123.758 |
| 0.7381944444444444 | 128.284 |
| 0.7388888888888889 | 132.814 |
| 0.7395833333333334 | 137.347 |
| 0.7402777777777777 | 141.884 |
| 0.7409722222222223 | 150.964 |
| 0.7416666666666667 | 160.056 |
| 0.7423611111111111 | 164.605 |
| 0.7430555555555555 | 164.605 |
| 0.74375 | 164.605 |
| 0.7444444444444445 | 160.056 |
| 0.7451388888888889 | 155.509 |
| 0.7458333333333332 | 155.509 |
| 0.7465277777777778 | 160.056 |
| 0.7472222222222222 | 164.605 |
| 0.7479166666666667 | 169.156 |
| 0.748611111111111 | 173.709 |
| 0.7493055555555556 | 169.156 |
| 0.75 | 164.605 |
| 0.7506944444444444 | 160.056 |
| 0.751388888888889 | 160.056 |
| 0.7520833333333333 | 155.509 |
| 0.7527777777777778 | 150.964 |
| 0.7534722222222222 | 146.423 |
| 0.7541666666666668 | 146.423 |
| 0.7548611111111111 | 137.347 |
| 0.7555555555555555 | 128.284 |
| 0.75625 | 123.758 |
| 0.7569444444444445 | 119.235 |
| 0.7576388888888889 | 119.235 |
| 0.7583333333333333 | 114.716 |
| 0.7590277777777777 | 110.201 |
| 0.7597222222222223 | 101.184 |
| 0.7604166666666666 | 96.682 |
| 0.7611111111111111 | 92.184 |
| 0.7618055555555556 | 87.692 |
| 0.7625000000000001 | 83.205 |
| 0.7631944444444444 | 83.205 |
| 0.7638888888888888 | 78.722 |
| 0.7645833333333334 | 83.205 |
| 0.7652777777777778 | 83.205 |
| 0.7659722222222222 | 87.692 |
| 0.7666666666666666 | 87.692 |
| 0.7673611111111112 | 92.184 |
| 0.7680555555555556 | 92.184 |
| 0.7687499999999999 | 92.184 |
| 0.7694444444444444 | 92.184 |
| 0.7701388888888889 | 87.692 |
| 0.7708333333333334 | 83.205 |
| 0.7715277777777777 | 78.722 |
| 0.7722222222222223 | 74.246 |
| 0.7729166666666667 | 69.775 |
| 0.7736111111111111 | 65.31 |
| 0.7743055555555555 | 60.85 |
| 0.775 | 60.85 |
| 0.7756944444444445 | 56.398 |
| 0.7763888888888889 | 56.398 |
| 0.7770833333333332 | 51.951 |
| 0.7777777777777778 | 51.951 |
| 0.7784722222222222 | 51.951 |
| 0.7791666666666667 | 51.951 |
| 0.779861111111111 | 51.951 |
| 0.7805555555555556 | 56.398 |
| 0.78125 | 56.398 |
| 0.7819444444444444 | 56.398 |
| 0.782638888888889 | 60.85 |
| 0.7833333333333333 | 60.85 |
| 0.7840277777777778 | 65.31 |
| 0.7847222222222222 | 65.31 |
| 0.7854166666666668 | 65.31 |
| 0.7861111111111111 | 65.31 |
| 0.7868055555555555 | 65.31 |
| 0.7875 | 65.31 |
| 0.7881944444444445 | 65.31 |
| 0.7888888888888889 | 65.31 |
| 0.7895833333333333 | 60.85 |
| 0.7902777777777777 | 56.398 |
| 0.7909722222222223 | 51.951 |
| 0.7916666666666666 | 47.511 |
| 0.7923611111111111 | 43.079 |
| 0.7930555555555556 | 38.653 |
| 0.7937500000000001 | 34.234 |
| 0.7944444444444444 | 34.234 |
| 0.7951388888888888 | 38.653 |
| 0.7958333333333334 | 38.653 |
| 0.7965277777777778 | 38.653 |
| 0.7972222222222222 | 43.079 |
| 0.7979166666666666 | 47.511 |
| 0.7986111111111112 | 47.511 |
| 0.7993055555555556 | 47.511 |
| 0.7999999999999999 | 51.951 |
| 0.8006944444444444 | 51.951 |
| 0.8013888888888889 | 51.951 |
| 0.8020833333333334 | 56.398 |
| 0.8027777777777777 | 56.398 |
| 0.8034722222222223 | 56.398 |
| 0.8041666666666667 | 56.398 |
| 0.8048611111111111 | 56.398 |
| 0.8055555555555555 | 56.398 |
| 0.80625 | 56.398 |
| 0.8069444444444445 | 56.398 |
| 0.8076388888888889 | 56.398 |
| 0.8083333333333332 | 56.398 |
| 0.8090277777777778 | 56.398 |
| 0.8097222222222222 | 51.951 |
| 0.8104166666666667 | 51.951 |
| 0.811111111111111 | 47.511 |
| 0.8118055555555556 | 47.511 |
| 0.8125 | 43.079 |
| 0.8131944444444444 | 43.079 |
| 0.813888888888889 | 43.079 |
| 0.8145833333333333 | 38.653 |
| 0.8152777777777778 | 38.653 |
| 0.8159722222222222 | 38.653 |
| 0.8166666666666668 | 38.653 |
| 0.8173611111111111 | 38.653 |
| 0.8180555555555555 | 34.234 |
| 0.81875 | 34.234 |
| 0.8194444444444445 | 34.234 |
| 0.8201388888888889 | 29.823 |
| 0.8208333333333333 | 29.823 |
| 0.8215277777777777 | 29.823 |
| 0.8222222222222223 | 25.419 |
| 0.8229166666666666 | 25.419 |
| 0.8236111111111111 | 25.419 |
| 0.8243055555555556 | 21.024 |
| 0.8250000000000001 | 21.024 |
| 0.8256944444444444 | 21.024 |
| 0.8263888888888888 | 16.636 |
| 0.8270833333333334 | 16.636 |
| 0.8277777777777778 | 16.636 |
| 0.8284722222222222 | 16.636 |
| 0.8291666666666666 | 16.636 |
| 0.8298611111111112 | 16.636 |
| 0.8305555555555556 | 16.636 |
| 0.8312499999999999 | 16.636 |
| 0.8319444444444444 | 16.636 |
| 0.8326388888888889 | 16.636 |
| 0.8333333333333334 | 16.636 |
| 0.8340277777777777 | 16.636 |
| 0.8347222222222223 | 12.257 |
| 0.8354166666666667 | 12.257 |
| 0.8361111111111111 | 12.257 |
| 0.8368055555555555 | 12.257 |
| 0.8375 | 7.887 |
| 0.8381944444444445 | 7.887 |
| 0.8388888888888889 | 7.887 |
| 0.8395833333333332 | 3.525 |
| 0.8402777777777778 | 3.525 |
| 0.8409722222222222 | 3.525 |
| 0.8416666666666667 | 3.525 |
| 0.842361111111111 | 3.525 |
| 0.8430555555555556 | 0 |
| 0.84375 | 0 |
| 0.8444444444444444 | 0 |
| 0.845138888888889 | 0 |
| 0.8458333333333333 | 0 |
| 0.8465277777777778 | 0 |
| 0.8472222222222222 | 0 |
| 0.8479166666666668 | 0 |
| 0.8486111111111111 | 0 |
| 0.8493055555555555 | 0 |
| 0.85 | 0 |
| 0.8506944444444445 | 0 |
| 0.8513888888888889 | 0 |
| 0.8520833333333333 | 0 |
| 0.8527777777777777 | 0 |
| 0.8534722222222223 | 0 |
| 0.8541666666666666 | 0 |
| 0.8548611111111111 | 0 |
| 0.8555555555555556 | 0 |
| 0.8562500000000001 | 0 |
| 0.8569444444444444 | 0 |
| 0.8576388888888888 | 0 |
| 0.8583333333333334 | 0 |
| 0.8590277777777778 | 0 |
| 0.8597222222222222 | 0 |
| 0.8604166666666666 | 0 |
| 0.8611111111111112 | 0 |
| 0.8618055555555556 | 0 |
| 0.8624999999999999 | 0 |
| 0.8631944444444444 | 0 |
| 0.8638888888888889 | 0 |
| 0.8645833333333334 | 0 |
| 0.8652777777777777 | 0 |
| 0.8659722222222223 | 0 |
| 0.8666666666666667 | 0 |
| 0.8673611111111111 | 0 |
| 0.8680555555555555 | 0 |
| 0.86875 | 0 |
| 0.8694444444444445 | 0 |
| 0.8701388888888889 | 0 |
| 0.8708333333333332 | 0 |
| 0.8715277777777778 | 0 |
| 0.8722222222222222 | 0 |
| 0.8729166666666667 | 0 |
| 0.873611111111111 | 0 |
| 0.8743055555555556 | 0 |
| 0.875 | 0 |
| 0.8756944444444444 | 0 |
| 0.876388888888889 | 0 |
| 0.8770833333333333 | 0 |
| 0.8777777777777778 | 0 |
| 0.8784722222222222 | 0 |
| 0.8791666666666668 | 0 |
| 0.8798611111111111 | 0 |
| 0.8805555555555555 | 0 |
| 0.88125 | 0 |
| 0.8819444444444445 | 0 |
| 0.8826388888888889 | 0 |
| 0.8833333333333333 | 0 |
| 0.8840277777777777 | 0 |
| 0.8847222222222223 | 0 |
| 0.8854166666666666 | 0 |
| 0.8861111111111111 | 0 |
| 0.8868055555555556 | 0 |
| 0.8875000000000001 | 0 |
| 0.8881944444444444 | 0 |
| 0.8888888888888888 | 0 |
| 0.8895833333333334 | 0 |
| 0.8902777777777778 | 0 |
| 0.8909722222222222 | 0 |
| 0.8916666666666666 | 0 |
| 0.8923611111111112 | 0 |
| 0.8930555555555556 | 0 |
| 0.8937499999999999 | 0 |
| 0.8944444444444444 | 0 |
| 0.8951388888888889 | 0 |
| 0.8958333333333334 | 0 |
| 0.8965277777777777 | 0 |
| 0.8972222222222223 | 0 |
| 0.8979166666666667 | 0 |
| 0.8986111111111111 | 0 |
| 0.8993055555555555 | 0 |
| 0.9 | 0 |
| 0.9006944444444445 | 0 |
| 0.9013888888888889 | 0 |
| 0.9020833333333332 | 0 |
| 0.9027777777777778 | 0 |
| 0.9034722222222222 | 0 |
| 0.9041666666666667 | 0 |
| 0.904861111111111 | 0 |
| 0.9055555555555556 | 0 |
| 0.90625 | 0 |
| 0.9069444444444444 | 0 |
| 0.907638888888889 | 0 |
| 0.9083333333333333 | 0 |
| 0.9090277777777778 | 0 |
| 0.9097222222222222 | 0 |
| 0.9104166666666668 | 0 |
| 0.9111111111111111 | 0 |
| 0.9118055555555555 | 0 |
| 0.9125 | 0 |
| 0.9131944444444445 | 0 |
| 0.9138888888888889 | 0 |
| 0.9145833333333333 | 0 |
| 0.9152777777777777 | 0 |
| 0.9159722222222223 | 0 |
| 0.9166666666666666 | 0 |
| 0.9173611111111111 | 0 |
| 0.9180555555555556 | 0 |
| 0.9187500000000001 | 0 |
| 0.9194444444444444 | 0 |
| 0.9201388888888888 | 0 |
| 0.9208333333333334 | 0 |
| 0.9215277777777778 | 0 |
| 0.9222222222222222 | 0 |
| 0.9229166666666666 | 0 |
| 0.9236111111111112 | 0 |
| 0.9243055555555556 | 0 |
| 0.9249999999999999 | 0 |
| 0.9256944444444444 | 0 |
| 0.9263888888888889 | 0 |
| 0.9270833333333334 | 0 |
| 0.9277777777777777 | 0 |
| 0.9284722222222223 | 0 |
| 0.9291666666666667 | 0 |
| 0.9298611111111111 | 0 |
| 0.9305555555555555 | 0 |
| 0.93125 | 0 |
| 0.9319444444444445 | 0 |
| 0.9326388888888889 | 0 |
| 0.9333333333333332 | 0 |
| 0.9340277777777778 | 0 |
| 0.9347222222222222 | 0 |
| 0.9354166666666667 | 0 |
| 0.936111111111111 | 0 |
| 0.9368055555555556 | 0 |
| 0.9375 | 0 |
| 0.9381944444444444 | 0 |
| 0.938888888888889 | 0 |
| 0.9395833333333333 | 0 |
| 0.9402777777777778 | 0 |
| 0.9409722222222222 | 0 |
| 0.9416666666666668 | 0 |
| 0.9423611111111111 | 0 |
| 0.9430555555555555 | 0 |
| 0.94375 | 0 |
| 0.9444444444444445 | 0 |
| 0.9451388888888889 | 0 |
| 0.9458333333333333 | 0 |
| 0.9465277777777777 | 0 |
| 0.9472222222222223 | 0 |
| 0.9479166666666666 | 0 |
| 0.9486111111111111 | 0 |
| 0.9493055555555556 | 0 |
| 0.9500000000000001 | 0 |
| 0.9506944444444444 | 0 |
| 0.9513888888888888 | 0 |
| 0.9520833333333334 | 0 |
| 0.9527777777777778 | 0 |
| 0.9534722222222222 | 0 |
| 0.9541666666666666 | 0 |
| 0.9548611111111112 | 0 |
| 0.9555555555555556 | 0 |
| 0.9562499999999999 | 0 |
| 0.9569444444444444 | 0 |
| 0.9576388888888889 | 0 |
| 0.9583333333333334 | 0 |
| 0.9590277777777777 | 0 |
| 0.9597222222222223 | 0 |
| 0.9604166666666667 | 0 |
| 0.9611111111111111 | 0 |
| 0.9618055555555555 | 0 |
| 0.9625 | 0 |
| 0.9631944444444445 | 0 |
| 0.9638888888888889 | 0 |
| 0.9645833333333332 | 0 |
| 0.9652777777777778 | 0 |
| 0.9659722222222222 | 0 |
| 0.9666666666666667 | 0 |
| 0.967361111111111 | 0 |
| 0.9680555555555556 | 0 |
| 0.96875 | 0 |
| 0.9694444444444444 | 0 |
| 0.970138888888889 | 0 |
| 0.9708333333333333 | 0 |
| 0.9715277777777778 | 0 |
| 0.9722222222222222 | 0 |
| 0.9729166666666668 | 0 |
| 0.9736111111111111 | 0 |
| 0.9743055555555555 | 0 |
| 0.975 | 0 |
| 0.9756944444444445 | 0 |
| 0.9763888888888889 | 0 |
| 0.9770833333333333 | 0 |
| 0.9777777777777777 | 0 |
| 0.9784722222222223 | 0 |
| 0.9791666666666666 | 0 |
| 0.9798611111111111 | 0 |
| 0.9805555555555556 | 0 |
| 0.9812500000000001 | 0 |
| 0.9819444444444444 | 0 |
| 0.9826388888888888 | 0 |
| 0.9833333333333334 | 0 |
| 0.9840277777777778 | 0 |
| 0.9847222222222222 | 0 |
| 0.9854166666666666 | 0 |
| 0.9861111111111112 | 0 |
| 0.9868055555555556 | 0 |
| 0.9874999999999999 | 0 |
| 0.9881944444444444 | 0 |
| 0.9888888888888889 | 0 |
| 0.9895833333333334 | 0 |
| 0.9902777777777777 | 0 |
| 0.9909722222222223 | 0 |
| 0.9916666666666667 | 0 |
| 0.9923611111111111 | 0 |
| 0.9930555555555555 | 0 |
| 0.99375 | 0 |
| 0.9944444444444445 | 0 |
| 0.9951388888888889 | 0 |
| 0.9958333333333332 | 0 |
| 0.9965277777777778 | 0 |
| 0.9972222222222222 | 0 |
| 0.9979166666666667 | 0 |
| 0.998611111111111 | 0 |
| 0.9993055555555556 | 0 |